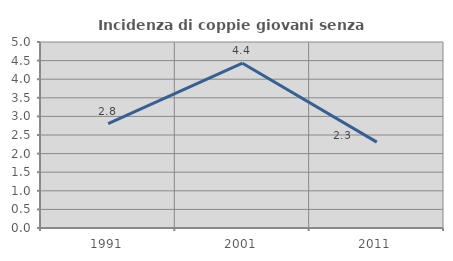
| Category | Incidenza di coppie giovani senza figli |
|---|---|
| 1991.0 | 2.807 |
| 2001.0 | 4.429 |
| 2011.0 | 2.309 |